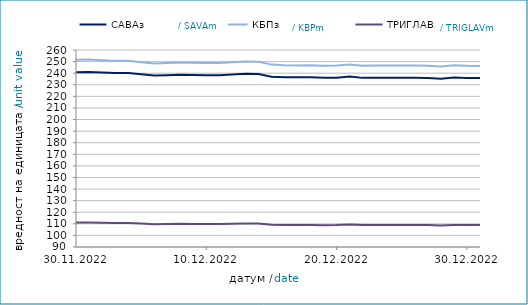
| Category | САВАз | КБПз | ТРИГЛАВз |
|---|---|---|---|
| 2022-11-30 | 240.782 | 251.517 | 111.128 |
| 2022-12-01 | 241.001 | 251.707 | 111.188 |
| 2022-12-02 | 240.505 | 251.158 | 110.934 |
| 2022-12-03 | 240.051 | 250.616 | 110.7 |
| 2022-12-04 | 240.064 | 250.63 | 110.706 |
| 2022-12-05 | 239.038 | 249.493 | 110.189 |
| 2022-12-06 | 238.032 | 248.447 | 109.712 |
| 2022-12-07 | 238.295 | 248.815 | 109.852 |
| 2022-12-08 | 238.595 | 249.164 | 110.009 |
| 2022-12-09 | 238.406 | 248.948 | 109.867 |
| 2022-12-10 | 238.304 | 248.814 | 109.801 |
| 2022-12-11 | 238.317 | 248.827 | 109.806 |
| 2022-12-12 | 238.832 | 249.394 | 110.123 |
| 2022-12-13 | 239.527 | 249.983 | 110.362 |
| 2022-12-14 | 239.325 | 249.852 | 110.288 |
| 2022-12-15 | 236.9 | 247.395 | 109.262 |
| 2022-12-16 | 236.552 | 246.765 | 109.018 |
| 2022-12-17 | 236.507 | 246.725 | 109.013 |
| 2022-12-18 | 236.519 | 246.739 | 109.018 |
| 2022-12-19 | 235.955 | 246.414 | 108.832 |
| 2022-12-20 | 236.155 | 246.6 | 108.934 |
| 2022-12-21 | 237.093 | 247.497 | 109.33 |
| 2022-12-22 | 235.949 | 246.385 | 108.889 |
| 2022-12-23 | 236.045 | 246.614 | 109.005 |
| 2022-12-24 | 236.02 | 246.602 | 109.016 |
| 2022-12-25 | 236.032 | 246.615 | 109.022 |
| 2022-12-26 | 236.04 | 246.606 | 109.027 |
| 2022-12-27 | 235.827 | 246.493 | 108.979 |
| 2022-12-28 | 235.177 | 245.716 | 108.659 |
| 2022-12-29 | 236.31 | 246.794 | 109.065 |
| 2022-12-30 | 235.927 | 246.321 | 108.93 |
| 2022-12-31 | 235.844 | 246.232 | 108.892 |